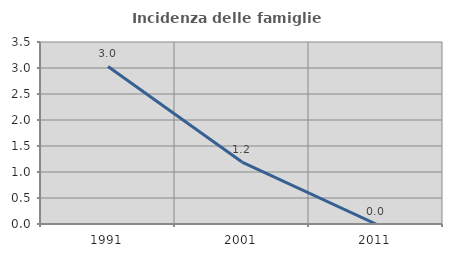
| Category | Incidenza delle famiglie numerose |
|---|---|
| 1991.0 | 3.03 |
| 2001.0 | 1.19 |
| 2011.0 | 0 |